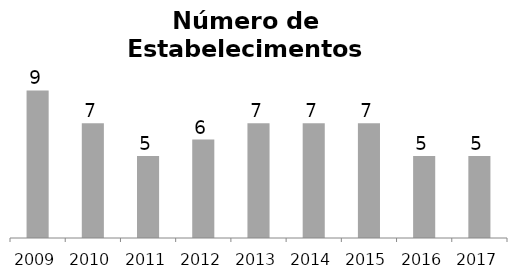
| Category | Transporte Aéreo |
|---|---|
| 2009.0 | 9 |
| 2010.0 | 7 |
| 2011.0 | 5 |
| 2012.0 | 6 |
| 2013.0 | 7 |
| 2014.0 | 7 |
| 2015.0 | 7 |
| 2016.0 | 5 |
| 2017.0 | 5 |